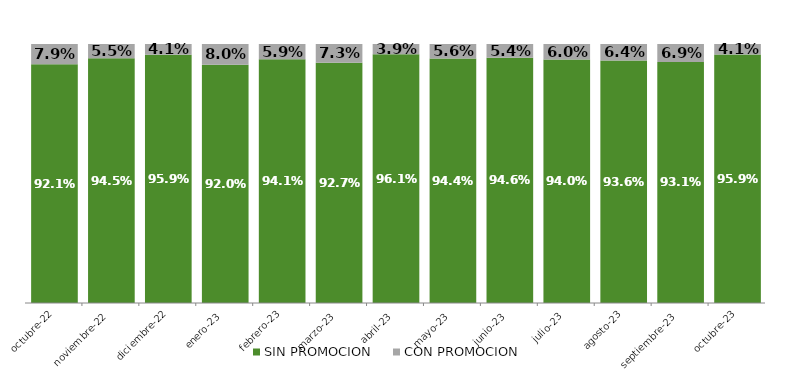
| Category | SIN PROMOCION   | CON PROMOCION   |
|---|---|---|
| 2022-10-01 | 0.921 | 0.079 |
| 2022-11-01 | 0.945 | 0.055 |
| 2022-12-01 | 0.959 | 0.041 |
| 2023-01-01 | 0.92 | 0.08 |
| 2023-02-01 | 0.941 | 0.059 |
| 2023-03-01 | 0.927 | 0.073 |
| 2023-04-01 | 0.961 | 0.039 |
| 2023-05-01 | 0.944 | 0.056 |
| 2023-06-01 | 0.946 | 0.054 |
| 2023-07-01 | 0.94 | 0.06 |
| 2023-08-01 | 0.936 | 0.064 |
| 2023-09-01 | 0.931 | 0.069 |
| 2023-10-01 | 0.959 | 0.041 |